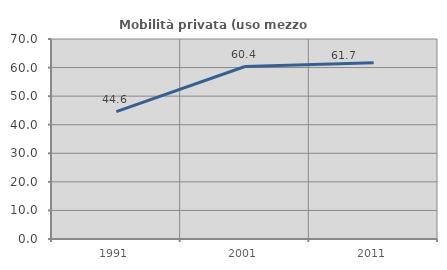
| Category | Mobilità privata (uso mezzo privato) |
|---|---|
| 1991.0 | 44.601 |
| 2001.0 | 60.37 |
| 2011.0 | 61.712 |